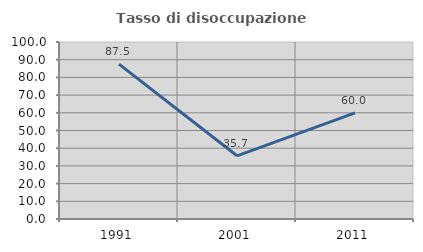
| Category | Tasso di disoccupazione giovanile  |
|---|---|
| 1991.0 | 87.5 |
| 2001.0 | 35.714 |
| 2011.0 | 60 |